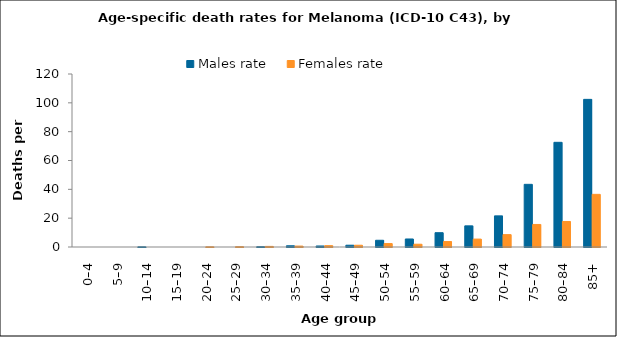
| Category | Males rate | Females rate |
|---|---|---|
| 0–4 | 0 | 0 |
| 5–9 | 0 | 0 |
| 10–14 | 0.119 | 0 |
| 15–19 | 0 | 0 |
| 20–24 | 0 | 0.126 |
| 25–29 | 0 | 0.222 |
| 30–34 | 0.211 | 0.413 |
| 35–39 | 0.851 | 0.629 |
| 40–44 | 0.713 | 0.927 |
| 45–49 | 1.245 | 1.22 |
| 50–54 | 4.669 | 2.382 |
| 55–59 | 5.566 | 1.922 |
| 60–64 | 9.924 | 3.781 |
| 65–69 | 14.666 | 5.476 |
| 70–74 | 21.591 | 8.59 |
| 75–79 | 43.471 | 15.633 |
| 80–84 | 72.612 | 17.694 |
| 85+ | 102.401 | 36.516 |